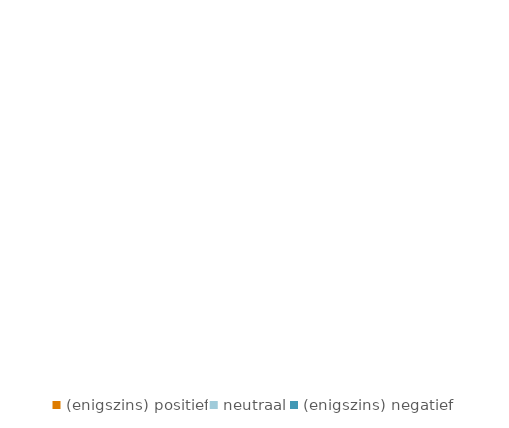
| Category | Series 0 |
|---|---|
| (enigszins) positief | 0 |
| neutraal | 0 |
| (enigszins) negatief | 0 |